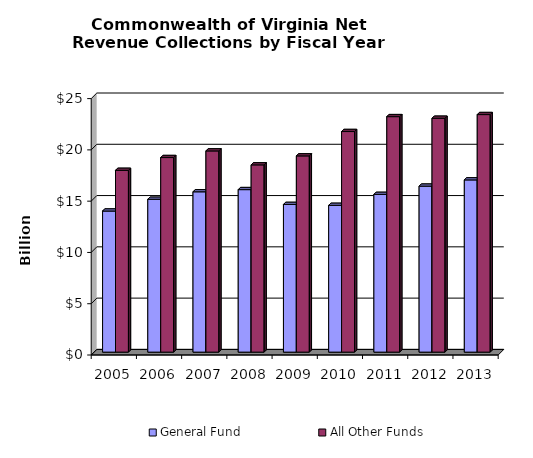
| Category | General Fund | All Other Funds |
|---|---|---|
| 2005.0 | 13.755 | 17.723 |
| 2006.0 | 14.904 | 18.971 |
| 2007.0 | 15.633 | 19.618 |
| 2008.0 | 15.845 | 18.257 |
| 2009.0 | 14.398 | 19.134 |
| 2010.0 | 14.31 | 21.508 |
| 2011.0 | 15.379 | 22.96 |
| 2012.0 | 16.182 | 22.803 |
| 2013.0 | 16.792 | 23.162 |